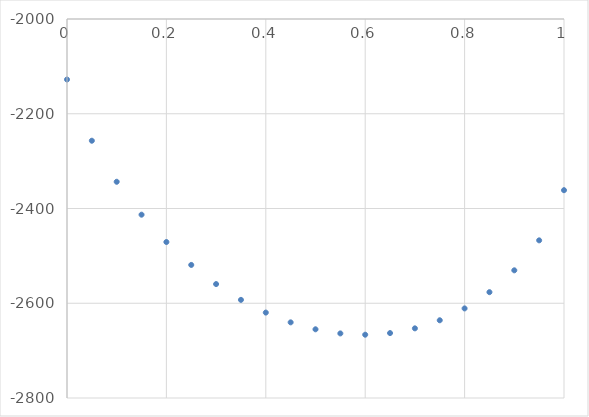
| Category | Series 0 |
|---|---|
| 0.0 | -2127.72 |
| 0.05 | -2256.948 |
| 0.1 | -2343.573 |
| 0.15 | -2413.062 |
| 0.2 | -2470.748 |
| 0.25 | -2519.101 |
| 0.3 | -2559.518 |
| 0.35 | -2592.861 |
| 0.4 | -2619.681 |
| 0.45 | -2640.319 |
| 0.5 | -2654.966 |
| 0.55 | -2663.682 |
| 0.6 | -2666.407 |
| 0.65 | -2662.951 |
| 0.7 | -2652.971 |
| 0.75 | -2635.917 |
| 0.8 | -2610.927 |
| 0.85 | -2576.604 |
| 0.9 | -2530.479 |
| 0.95 | -2467.216 |
| 1.0 | -2361.352 |